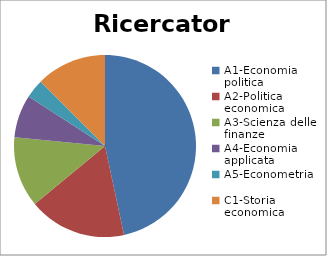
| Category | Ricercatori | Series 1 |
|---|---|---|
| A1-Economia politica | 153 |  |
| A2-Politica economica | 57 |  |
| A3-Scienza delle finanze | 41 |  |
| A4-Economia applicata | 25 |  |
| A5-Econometria | 11 |  |
| C1-Storia economica | 41 |  |